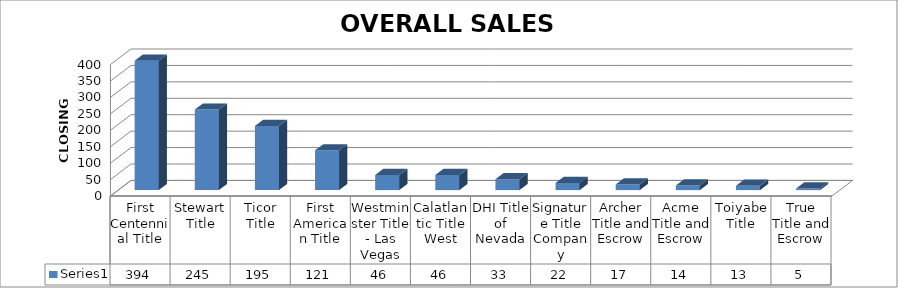
| Category | Series 0 |
|---|---|
| First Centennial Title | 394 |
| Stewart Title | 245 |
| Ticor Title | 195 |
| First American Title | 121 |
| Westminster Title - Las Vegas | 46 |
| Calatlantic Title West | 46 |
| DHI Title of Nevada | 33 |
| Signature Title Company | 22 |
| Archer Title and Escrow | 17 |
| Acme Title and Escrow | 14 |
| Toiyabe Title | 13 |
| True Title and Escrow | 5 |